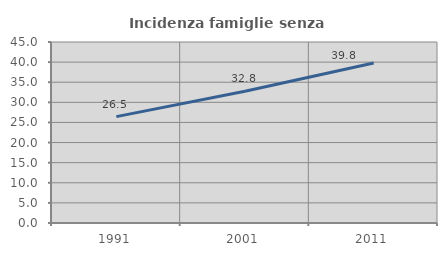
| Category | Incidenza famiglie senza nuclei |
|---|---|
| 1991.0 | 26.451 |
| 2001.0 | 32.776 |
| 2011.0 | 39.797 |